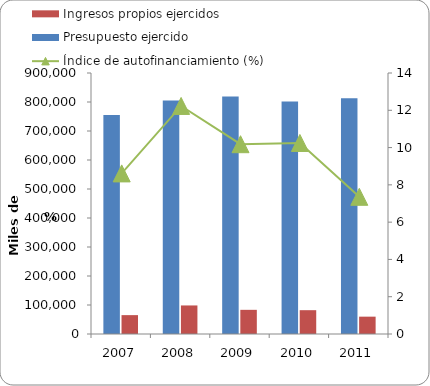
| Category | Presupuesto ejercido | Ingresos propios ejercidos  |
|---|---|---|
| 2007 | 755421 | 65076 |
| 2008 | 804875 | 98456 |
| 2009 | 818576 | 83337 |
| 2010 | 801583 | 82131 |
| 2011 | 812630 | 59802 |